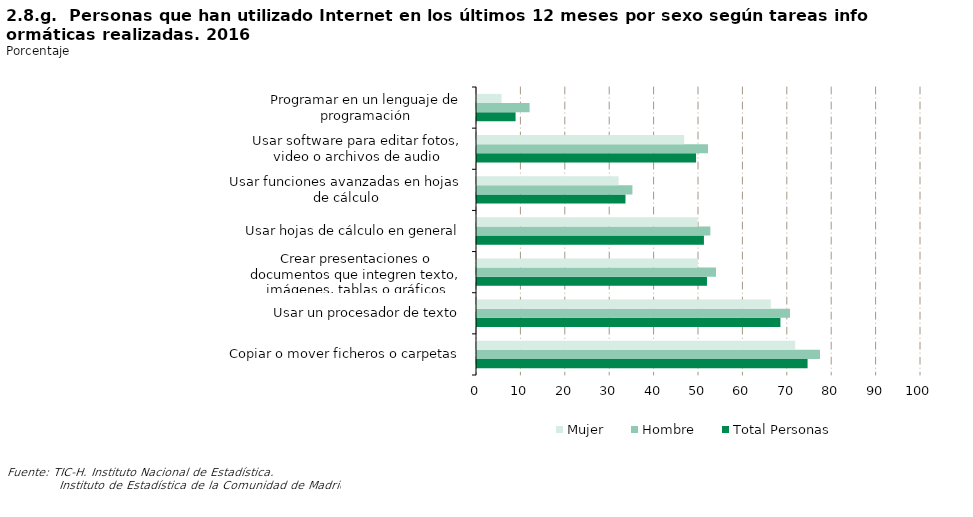
| Category | Total Personas | Hombre | Mujer |
|---|---|---|---|
| Copiar o mover ficheros o carpetas | 74.454 | 77.253 | 71.661 |
| Usar un procesador de texto | 68.334 | 70.493 | 66.18 |
| Crear presentaciones o documentos que integren texto, imágenes, tablas o gráficos | 51.79 | 53.825 | 49.759 |
| Usar hojas de cálculo en general | 51.111 | 52.56 | 49.665 |
| Usar funciones avanzadas en hojas de cálculo | 33.44 | 35.005 | 31.879 |
| Usar software para editar fotos, video o archivos de audio | 49.343 | 52.023 | 46.667 |
| Programar en un lenguaje de programación | 8.687 | 11.845 | 5.535 |